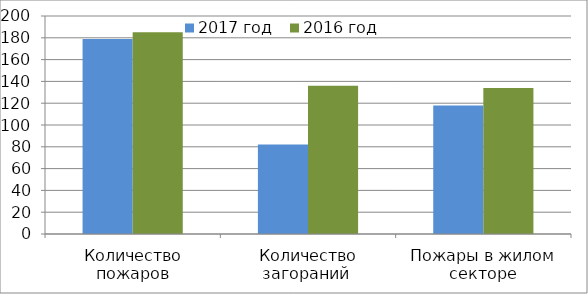
| Category | 2017 год | 2016 год |
|---|---|---|
| Количество пожаров | 179 | 185 |
| Количество загораний  | 82 | 136 |
| Пожары в жилом секторе | 118 | 134 |